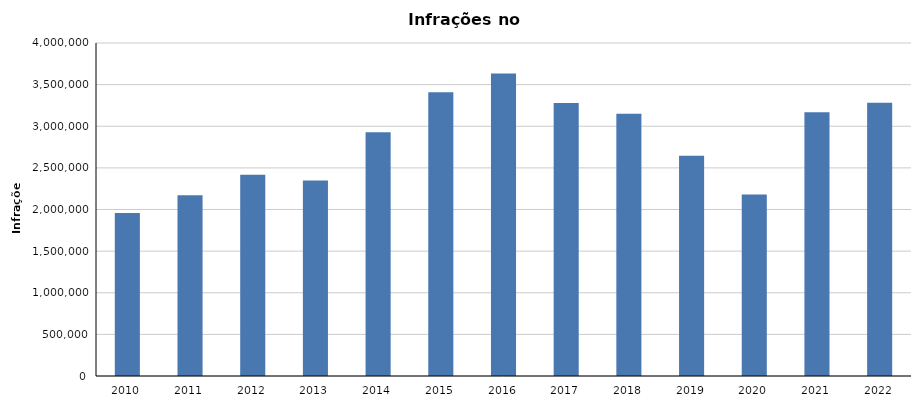
| Category | Infrações |
|---|---|
| 2010 | 1959096 |
| 2011 | 2172018 |
| 2012 | 2416835 |
| 2013 | 2347586 |
| 2014 | 2928315 |
| 2015 | 3409351 |
| 2016 | 3632325 |
| 2017 | 3278272 |
| 2018 | 3150474 |
| 2019 | 2644650 |
| 2020 | 2179026 |
| 2021 | 3167485 |
| 2022 | 3283739 |